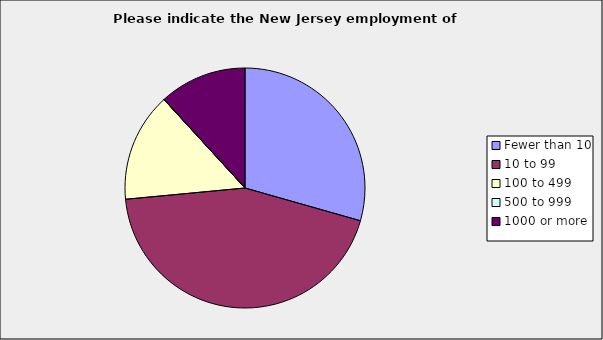
| Category | Series 0 |
|---|---|
| Fewer than 10 | 0.294 |
| 10 to 99 | 0.441 |
| 100 to 499 | 0.147 |
| 500 to 999 | 0 |
| 1000 or more | 0.118 |